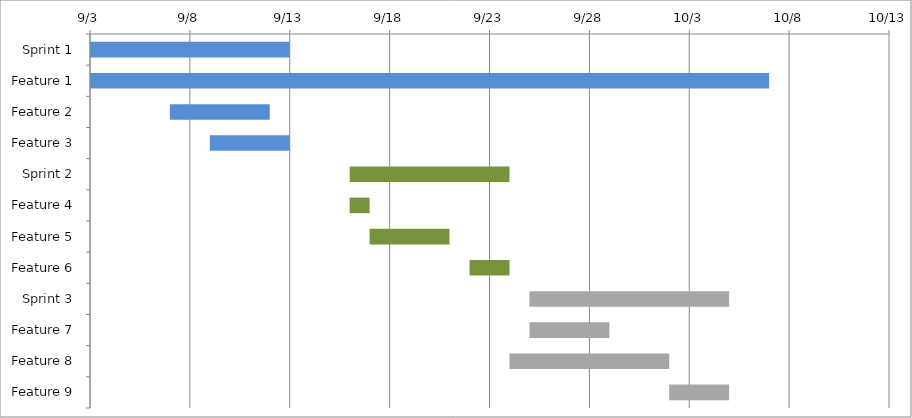
| Category | Start | Days |
|---|---|---|
| Sprint 1 | 2016-09-01 | 12 |
| Feature 1 | 2016-09-01 | 36 |
| Feature 2 | 2016-09-07 | 5 |
| Feature 3 | 2016-09-09 | 4 |
| Sprint 2 | 2016-09-16 | 8 |
| Feature 4 | 2016-09-16 | 1 |
| Feature 5 | 2016-09-17 | 4 |
| Feature 6 | 2016-09-22 | 2 |
| Sprint 3 | 2016-09-25 | 10 |
| Feature 7 | 2016-09-25 | 4 |
| Feature 8 | 2016-09-24 | 8 |
| Feature 9 | 2016-10-02 | 3 |